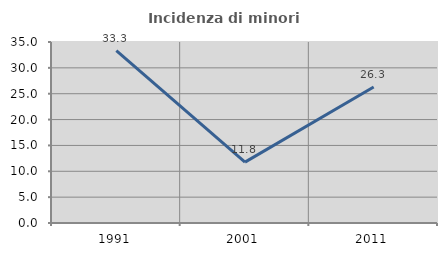
| Category | Incidenza di minori stranieri |
|---|---|
| 1991.0 | 33.333 |
| 2001.0 | 11.765 |
| 2011.0 | 26.289 |